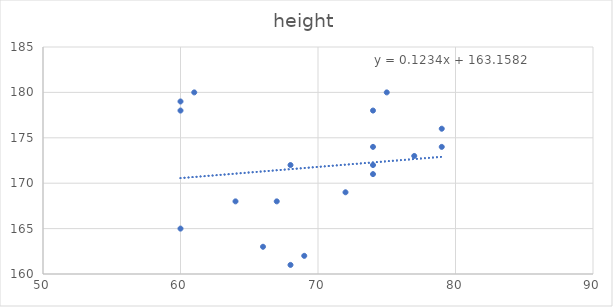
| Category | height |
|---|---|
| 74.0 | 172 |
| 79.0 | 174 |
| 77.0 | 173 |
| 60.0 | 179 |
| 72.0 | 169 |
| 74.0 | 174 |
| 74.0 | 178 |
| 66.0 | 163 |
| 68.0 | 172 |
| 64.0 | 168 |
| 60.0 | 165 |
| 79.0 | 176 |
| 60.0 | 178 |
| 74.0 | 171 |
| 69.0 | 162 |
| 61.0 | 180 |
| 75.0 | 180 |
| 67.0 | 168 |
| 68.0 | 161 |